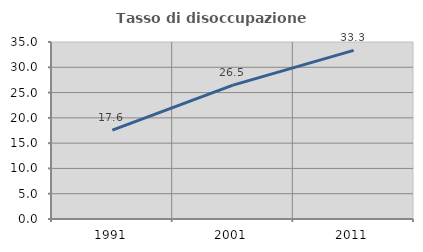
| Category | Tasso di disoccupazione giovanile  |
|---|---|
| 1991.0 | 17.582 |
| 2001.0 | 26.471 |
| 2011.0 | 33.333 |